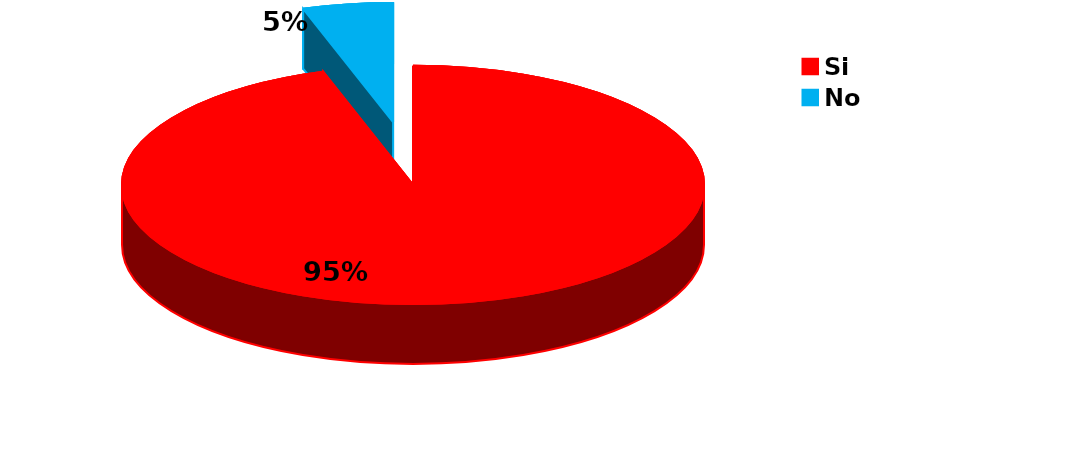
| Category | Series 0 |
|---|---|
| Si | 57 |
| No | 3 |